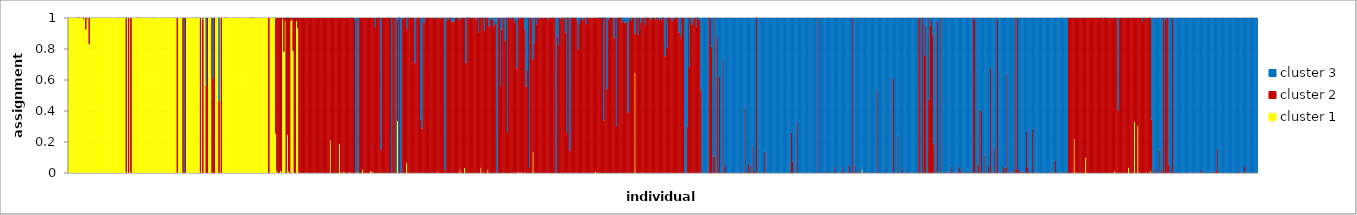
| Category | cluster 1 | cluster 2 | cluster 3 |
|---|---|---|---|
| 0 | 1 | 0 | 0 |
| 1 | 1 | 0 | 0 |
| 2 | 1 | 0 | 0 |
| 3 | 1 | 0 | 0 |
| 4 | 1 | 0 | 0 |
| 5 | 1 | 0 | 0 |
| 6 | 1 | 0 | 0 |
| 7 | 1 | 0 | 0 |
| 8 | 1 | 0 | 0 |
| 9 | 0.999 | 0.001 | 0 |
| 10 | 1 | 0 | 0 |
| 11 | 1 | 0 | 0 |
| 12 | 1 | 0 | 0 |
| 13 | 0.992 | 0.008 | 0 |
| 14 | 1 | 0 | 0 |
| 15 | 0.924 | 0.076 | 0 |
| 16 | 0.995 | 0.005 | 0 |
| 17 | 1 | 0 | 0 |
| 18 | 0.828 | 0.172 | 0 |
| 19 | 1 | 0 | 0 |
| 20 | 1 | 0 | 0 |
| 21 | 1 | 0 | 0 |
| 22 | 1 | 0 | 0 |
| 23 | 1 | 0 | 0 |
| 24 | 1 | 0 | 0 |
| 25 | 1 | 0 | 0 |
| 26 | 1 | 0 | 0 |
| 27 | 1 | 0 | 0 |
| 28 | 1 | 0 | 0 |
| 29 | 1 | 0 | 0 |
| 30 | 1 | 0 | 0 |
| 31 | 1 | 0 | 0 |
| 32 | 1 | 0 | 0 |
| 33 | 1 | 0 | 0 |
| 34 | 1 | 0 | 0 |
| 35 | 1 | 0 | 0 |
| 36 | 1 | 0 | 0 |
| 37 | 1 | 0 | 0 |
| 38 | 1 | 0 | 0 |
| 39 | 1 | 0 | 0 |
| 40 | 1 | 0 | 0 |
| 41 | 1 | 0 | 0 |
| 42 | 1 | 0 | 0 |
| 43 | 0.997 | 0.003 | 0 |
| 44 | 1 | 0 | 0 |
| 45 | 1 | 0 | 0 |
| 46 | 1 | 0 | 0 |
| 47 | 1 | 0 | 0 |
| 48 | 1 | 0 | 0 |
| 49 | 1 | 0 | 0 |
| 50 | 0.001 | 0.998 | 0.001 |
| 51 | 1 | 0 | 0 |
| 52 | 0 | 1 | 0 |
| 53 | 1 | 0 | 0 |
| 54 | 0 | 1 | 0 |
| 55 | 1 | 0 | 0 |
| 56 | 1 | 0 | 0 |
| 57 | 1 | 0 | 0 |
| 58 | 1 | 0 | 0 |
| 59 | 1 | 0 | 0 |
| 60 | 1 | 0 | 0 |
| 61 | 0.998 | 0.002 | 0 |
| 62 | 1 | 0 | 0 |
| 63 | 1 | 0 | 0 |
| 64 | 1 | 0 | 0 |
| 65 | 1 | 0 | 0 |
| 66 | 1 | 0 | 0 |
| 67 | 1 | 0 | 0 |
| 68 | 1 | 0 | 0 |
| 69 | 1 | 0 | 0 |
| 70 | 1 | 0 | 0 |
| 71 | 1 | 0 | 0 |
| 72 | 1 | 0 | 0 |
| 73 | 0.997 | 0.003 | 0 |
| 74 | 1 | 0 | 0 |
| 75 | 1 | 0 | 0 |
| 76 | 1 | 0 | 0 |
| 77 | 1 | 0 | 0 |
| 78 | 1 | 0 | 0 |
| 79 | 1 | 0 | 0 |
| 80 | 1 | 0 | 0 |
| 81 | 1 | 0 | 0 |
| 82 | 1 | 0 | 0 |
| 83 | 1 | 0 | 0 |
| 84 | 1 | 0 | 0 |
| 85 | 1 | 0 | 0 |
| 86 | 1 | 0 | 0 |
| 87 | 1 | 0 | 0 |
| 88 | 1 | 0 | 0 |
| 89 | 1 | 0 | 0 |
| 90 | 1 | 0 | 0 |
| 91 | 1 | 0 | 0 |
| 92 | 1 | 0 | 0 |
| 93 | 1 | 0 | 0 |
| 94 | 0 | 1 | 0 |
| 95 | 1 | 0 | 0 |
| 96 | 1 | 0 | 0 |
| 97 | 1 | 0 | 0 |
| 98 | 1 | 0 | 0 |
| 99 | 0 | 1 | 0 |
| 100 | 0 | 0 | 1 |
| 101 | 0.001 | 0.999 | 0 |
| 102 | 1 | 0 | 0 |
| 103 | 1 | 0 | 0 |
| 104 | 1 | 0 | 0 |
| 105 | 1 | 0 | 0 |
| 106 | 1 | 0 | 0 |
| 107 | 1 | 0 | 0 |
| 108 | 1 | 0 | 0 |
| 109 | 1 | 0 | 0 |
| 110 | 1 | 0 | 0 |
| 111 | 0.998 | 0.002 | 0 |
| 112 | 1 | 0 | 0 |
| 113 | 1 | 0 | 0 |
| 114 | 0 | 1 | 0 |
| 115 | 1 | 0 | 0 |
| 116 | 0 | 0.988 | 0.012 |
| 117 | 1 | 0 | 0 |
| 118 | 1 | 0 | 0 |
| 119 | 0 | 0.563 | 0.437 |
| 120 | 0 | 1 | 0 |
| 121 | 1 | 0 | 0 |
| 122 | 1 | 0 | 0 |
| 123 | 1 | 0 | 0 |
| 124 | 0 | 1 | 0 |
| 125 | 0 | 0.609 | 0.391 |
| 126 | 0 | 1 | 0 |
| 127 | 1 | 0 | 0 |
| 128 | 1 | 0 | 0 |
| 129 | 1 | 0 | 0 |
| 130 | 0 | 0.464 | 0.536 |
| 131 | 1 | 0 | 0 |
| 132 | 0 | 0.997 | 0.003 |
| 133 | 1 | 0 | 0 |
| 134 | 1 | 0 | 0 |
| 135 | 1 | 0 | 0 |
| 136 | 0.999 | 0.001 | 0 |
| 137 | 1 | 0 | 0 |
| 138 | 1 | 0 | 0 |
| 139 | 1 | 0 | 0 |
| 140 | 1 | 0 | 0 |
| 141 | 1 | 0 | 0 |
| 142 | 1 | 0 | 0 |
| 143 | 1 | 0 | 0 |
| 144 | 1 | 0 | 0 |
| 145 | 1 | 0 | 0 |
| 146 | 0.998 | 0.002 | 0 |
| 147 | 1 | 0 | 0 |
| 148 | 1 | 0 | 0 |
| 149 | 1 | 0 | 0 |
| 150 | 1 | 0 | 0 |
| 151 | 1 | 0 | 0 |
| 152 | 1 | 0 | 0 |
| 153 | 1 | 0 | 0 |
| 154 | 1 | 0 | 0 |
| 155 | 1 | 0 | 0 |
| 156 | 1 | 0 | 0 |
| 157 | 1 | 0 | 0 |
| 158 | 0.998 | 0.002 | 0 |
| 159 | 1 | 0 | 0 |
| 160 | 0.998 | 0.002 | 0 |
| 161 | 1 | 0 | 0 |
| 162 | 1 | 0 | 0 |
| 163 | 1 | 0 | 0 |
| 164 | 1 | 0 | 0 |
| 165 | 1 | 0 | 0 |
| 166 | 1 | 0 | 0 |
| 167 | 1 | 0 | 0 |
| 168 | 1 | 0 | 0 |
| 169 | 1 | 0 | 0 |
| 170 | 1 | 0 | 0 |
| 171 | 1 | 0 | 0 |
| 172 | 1 | 0 | 0 |
| 173 | 0 | 1 | 0 |
| 174 | 1 | 0 | 0 |
| 175 | 1 | 0 | 0 |
| 176 | 1 | 0 | 0 |
| 177 | 1 | 0 | 0 |
| 178 | 1 | 0 | 0 |
| 179 | 0.252 | 0.744 | 0.003 |
| 180 | 0.007 | 0.993 | 0 |
| 181 | 0 | 1 | 0 |
| 182 | 0 | 1 | 0 |
| 183 | 0.013 | 0.987 | 0 |
| 184 | 0.005 | 0.995 | 0 |
| 185 | 0.994 | 0.006 | 0 |
| 186 | 0.781 | 0.219 | 0 |
| 187 | 0.981 | 0.019 | 0 |
| 188 | 0 | 0.999 | 0.001 |
| 189 | 0.243 | 0.757 | 0 |
| 190 | 0.008 | 0.991 | 0.001 |
| 191 | 0 | 1 | 0 |
| 192 | 0.98 | 0.02 | 0 |
| 193 | 0.987 | 0.013 | 0 |
| 194 | 0.786 | 0.214 | 0 |
| 195 | 0.001 | 0.999 | 0 |
| 196 | 0 | 1 | 0 |
| 197 | 0.98 | 0.02 | 0 |
| 198 | 0.931 | 0.069 | 0 |
| 199 | 0.001 | 0.997 | 0.002 |
| 200 | 0 | 1 | 0 |
| 201 | 0 | 1 | 0 |
| 202 | 0 | 1 | 0 |
| 203 | 0 | 1 | 0 |
| 204 | 0 | 1 | 0 |
| 205 | 0 | 1 | 0 |
| 206 | 0 | 1 | 0 |
| 207 | 0 | 1 | 0 |
| 208 | 0 | 1 | 0 |
| 209 | 0 | 1 | 0 |
| 210 | 0 | 1 | 0 |
| 211 | 0 | 1 | 0 |
| 212 | 0 | 1 | 0 |
| 213 | 0 | 1 | 0 |
| 214 | 0 | 1 | 0 |
| 215 | 0 | 1 | 0 |
| 216 | 0 | 1 | 0 |
| 217 | 0 | 1 | 0 |
| 218 | 0 | 1 | 0 |
| 219 | 0 | 1 | 0 |
| 220 | 0 | 1 | 0 |
| 221 | 0 | 1 | 0 |
| 222 | 0 | 1 | 0 |
| 223 | 0 | 1 | 0 |
| 224 | 0 | 1 | 0 |
| 225 | 0 | 1 | 0 |
| 226 | 0.208 | 0.792 | 0 |
| 227 | 0 | 1 | 0 |
| 228 | 0 | 1 | 0 |
| 229 | 0 | 1 | 0 |
| 230 | 0 | 1 | 0 |
| 231 | 0 | 1 | 0 |
| 232 | 0 | 1 | 0 |
| 233 | 0 | 1 | 0 |
| 234 | 0.186 | 0.814 | 0 |
| 235 | 0.001 | 0.999 | 0 |
| 236 | 0 | 1 | 0 |
| 237 | 0.003 | 0.997 | 0 |
| 238 | 0.005 | 0.995 | 0 |
| 239 | 0 | 1 | 0 |
| 240 | 0 | 1 | 0 |
| 241 | 0 | 1 | 0 |
| 242 | 0 | 1 | 0 |
| 243 | 0.004 | 0.996 | 0 |
| 244 | 0 | 0.999 | 0.001 |
| 245 | 0 | 1 | 0 |
| 246 | 0 | 1 | 0 |
| 247 | 0 | 0.987 | 0.013 |
| 248 | 0 | 0 | 1 |
| 249 | 0.005 | 0.995 | 0 |
| 250 | 0 | 0 | 1 |
| 251 | 0.001 | 0.999 | 0 |
| 252 | 0 | 1 | 0 |
| 253 | 0 | 1 | 0 |
| 254 | 0.019 | 0.981 | 0 |
| 255 | 0 | 1 | 0 |
| 256 | 0 | 1 | 0 |
| 257 | 0 | 1 | 0 |
| 258 | 0 | 1 | 0 |
| 259 | 0 | 1 | 0 |
| 260 | 0.002 | 0.998 | 0 |
| 261 | 0.011 | 0.989 | 0 |
| 262 | 0.003 | 0.997 | 0 |
| 263 | 0.001 | 0.999 | 0 |
| 264 | 0 | 1 | 0 |
| 265 | 0 | 0.941 | 0.059 |
| 266 | 0 | 1 | 0 |
| 267 | 0 | 1 | 0 |
| 268 | 0 | 0.999 | 0.001 |
| 269 | 0 | 1 | 0 |
| 270 | 0 | 0.149 | 0.851 |
| 271 | 0 | 1 | 0 |
| 272 | 0 | 1 | 0 |
| 273 | 0 | 1 | 0 |
| 274 | 0 | 1 | 0 |
| 275 | 0 | 1 | 0 |
| 276 | 0 | 0.999 | 0.001 |
| 277 | 0 | 1 | 0 |
| 278 | 0 | 1 | 0 |
| 279 | 0 | 0 | 1 |
| 280 | 0 | 1 | 0 |
| 281 | 0 | 1 | 0 |
| 282 | 0 | 1 | 0 |
| 283 | 0 | 0.002 | 0.998 |
| 284 | 0.334 | 0.656 | 0.011 |
| 285 | 0 | 0 | 1 |
| 286 | 0 | 0.999 | 0.001 |
| 287 | 0 | 0 | 1 |
| 288 | 0.002 | 0.994 | 0.004 |
| 289 | 0 | 0.994 | 0.006 |
| 290 | 0 | 1 | 0 |
| 291 | 0 | 1 | 0 |
| 292 | 0.063 | 0.865 | 0.072 |
| 293 | 0 | 1 | 0 |
| 294 | 0 | 1 | 0 |
| 295 | 0 | 0.999 | 0.001 |
| 296 | 0 | 1 | 0 |
| 297 | 0.002 | 0.998 | 0 |
| 298 | 0 | 1 | 0 |
| 299 | 0 | 0.71 | 0.29 |
| 300 | 0 | 0.995 | 0.005 |
| 301 | 0 | 1 | 0 |
| 302 | 0 | 1 | 0 |
| 303 | 0 | 1 | 0 |
| 304 | 0 | 0.344 | 0.656 |
| 305 | 0 | 0.284 | 0.716 |
| 306 | 0 | 1 | 0 |
| 307 | 0 | 0.969 | 0.031 |
| 308 | 0 | 1 | 0 |
| 309 | 0 | 1 | 0 |
| 310 | 0 | 1 | 0 |
| 311 | 0 | 1 | 0 |
| 312 | 0 | 1 | 0 |
| 313 | 0 | 1 | 0 |
| 314 | 0 | 0.998 | 0.002 |
| 315 | 0 | 1 | 0 |
| 316 | 0 | 0.992 | 0.008 |
| 317 | 0 | 1 | 0 |
| 318 | 0 | 0.996 | 0.004 |
| 319 | 0.002 | 0.998 | 0 |
| 320 | 0 | 0.997 | 0.003 |
| 321 | 0 | 1 | 0 |
| 322 | 0 | 0.994 | 0.006 |
| 323 | 0 | 1 | 0 |
| 324 | 0 | 0.999 | 0.001 |
| 325 | 0 | 0.017 | 0.983 |
| 326 | 0 | 0.98 | 0.02 |
| 327 | 0 | 1 | 0 |
| 328 | 0 | 0.988 | 0.012 |
| 329 | 0 | 1 | 0 |
| 330 | 0 | 0.998 | 0.002 |
| 331 | 0 | 0.976 | 0.024 |
| 332 | 0 | 0.973 | 0.027 |
| 333 | 0 | 0.977 | 0.023 |
| 334 | 0 | 1 | 0 |
| 335 | 0 | 1 | 0 |
| 336 | 0 | 1 | 0 |
| 337 | 0 | 0.992 | 0.008 |
| 338 | 0.02 | 0.969 | 0.011 |
| 339 | 0 | 1 | 0 |
| 340 | 0 | 1 | 0 |
| 341 | 0 | 1 | 0 |
| 342 | 0.03 | 0.97 | 0 |
| 343 | 0 | 0.709 | 0.291 |
| 344 | 0 | 0.999 | 0.001 |
| 345 | 0 | 0.998 | 0.002 |
| 346 | 0 | 1 | 0 |
| 347 | 0 | 1 | 0 |
| 348 | 0 | 1 | 0 |
| 349 | 0 | 1 | 0 |
| 350 | 0 | 1 | 0 |
| 351 | 0 | 0.99 | 0.01 |
| 352 | 0 | 1 | 0 |
| 353 | 0 | 0.996 | 0.004 |
| 354 | 0 | 0.905 | 0.095 |
| 355 | 0 | 1 | 0 |
| 356 | 0.031 | 0.967 | 0.002 |
| 357 | 0 | 1 | 0 |
| 358 | 0 | 0.998 | 0.002 |
| 359 | 0 | 0.918 | 0.082 |
| 360 | 0 | 1 | 0 |
| 361 | 0 | 1 | 0 |
| 362 | 0.018 | 0.98 | 0.002 |
| 363 | 0 | 0.946 | 0.054 |
| 364 | 0 | 0.995 | 0.005 |
| 365 | 0 | 0.992 | 0.008 |
| 366 | 0 | 0.99 | 0.01 |
| 367 | 0 | 0.945 | 0.055 |
| 368 | 0 | 0.959 | 0.041 |
| 369 | 0 | 0.981 | 0.019 |
| 370 | 0 | 0 | 1 |
| 371 | 0 | 1 | 0 |
| 372 | 0 | 1 | 0 |
| 373 | 0 | 0.559 | 0.441 |
| 374 | 0 | 0.924 | 0.076 |
| 375 | 0 | 1 | 0 |
| 376 | 0 | 1 | 0 |
| 377 | 0 | 0.854 | 0.146 |
| 378 | 0 | 0.998 | 0.002 |
| 379 | 0 | 0.262 | 0.738 |
| 380 | 0 | 0.998 | 0.002 |
| 381 | 0 | 1 | 0 |
| 382 | 0 | 0.994 | 0.006 |
| 383 | 0 | 1 | 0 |
| 384 | 0.001 | 0.996 | 0.003 |
| 385 | 0 | 0.967 | 0.033 |
| 386 | 0 | 0.99 | 0.01 |
| 387 | 0 | 0.675 | 0.325 |
| 388 | 0.004 | 0.993 | 0.003 |
| 389 | 0.001 | 0.997 | 0.002 |
| 390 | 0 | 0.993 | 0.007 |
| 391 | 0.003 | 0.996 | 0.001 |
| 392 | 0 | 1 | 0 |
| 393 | 0 | 0.997 | 0.003 |
| 394 | 0.001 | 0.924 | 0.075 |
| 395 | 0 | 0.556 | 0.444 |
| 396 | 0 | 0.662 | 0.338 |
| 397 | 0 | 1 | 0 |
| 398 | 0 | 0.031 | 0.969 |
| 399 | 0 | 0.994 | 0.006 |
| 400 | 0 | 1 | 0 |
| 401 | 0.133 | 0.599 | 0.268 |
| 402 | 0 | 0.84 | 0.16 |
| 403 | 0 | 0.997 | 0.003 |
| 404 | 0 | 0.958 | 0.042 |
| 405 | 0 | 1 | 0 |
| 406 | 0 | 0.996 | 0.004 |
| 407 | 0 | 1 | 0 |
| 408 | 0 | 1 | 0 |
| 409 | 0 | 1 | 0 |
| 410 | 0 | 0.994 | 0.006 |
| 411 | 0 | 1 | 0 |
| 412 | 0 | 1 | 0 |
| 413 | 0 | 1 | 0 |
| 414 | 0 | 0.99 | 0.01 |
| 415 | 0 | 1 | 0 |
| 416 | 0 | 1 | 0 |
| 417 | 0 | 1 | 0 |
| 418 | 0 | 1 | 0 |
| 419 | 0 | 1 | 0 |
| 420 | 0 | 1 | 0 |
| 421 | 0 | 0 | 1 |
| 422 | 0 | 0.879 | 0.121 |
| 423 | 0 | 0.823 | 0.177 |
| 424 | 0 | 1 | 0 |
| 425 | 0 | 0.995 | 0.005 |
| 426 | 0 | 0.998 | 0.002 |
| 427 | 0 | 1 | 0 |
| 428 | 0 | 1 | 0 |
| 429 | 0 | 0.902 | 0.098 |
| 430 | 0 | 0.255 | 0.745 |
| 431 | 0 | 0.999 | 0.001 |
| 432 | 0 | 1 | 0 |
| 433 | 0 | 0.144 | 0.856 |
| 434 | 0 | 0.998 | 0.002 |
| 435 | 0 | 1 | 0 |
| 436 | 0 | 1 | 0 |
| 437 | 0 | 1 | 0 |
| 438 | 0 | 1 | 0 |
| 439 | 0 | 0.984 | 0.016 |
| 440 | 0 | 0.795 | 0.205 |
| 441 | 0 | 0.965 | 0.035 |
| 442 | 0 | 0.991 | 0.009 |
| 443 | 0 | 1 | 0 |
| 444 | 0 | 0.988 | 0.012 |
| 445 | 0 | 1 | 0 |
| 446 | 0 | 1 | 0 |
| 447 | 0 | 0.959 | 0.041 |
| 448 | 0 | 0.999 | 0.001 |
| 449 | 0 | 0.996 | 0.004 |
| 450 | 0 | 1 | 0 |
| 451 | 0 | 1 | 0 |
| 452 | 0 | 1 | 0 |
| 453 | 0 | 1 | 0 |
| 454 | 0 | 1 | 0 |
| 455 | 0.006 | 0.994 | 0 |
| 456 | 0 | 1 | 0 |
| 457 | 0 | 1 | 0 |
| 458 | 0 | 0.999 | 0.001 |
| 459 | 0 | 0.999 | 0.001 |
| 460 | 0 | 1 | 0 |
| 461 | 0 | 0.999 | 0.001 |
| 462 | 0 | 0.338 | 0.662 |
| 463 | 0 | 0.999 | 0.001 |
| 464 | 0 | 1 | 0 |
| 465 | 0 | 0.539 | 0.461 |
| 466 | 0 | 0.986 | 0.014 |
| 467 | 0 | 1 | 0 |
| 468 | 0 | 0.998 | 0.002 |
| 469 | 0 | 1 | 0 |
| 470 | 0 | 1 | 0 |
| 471 | 0 | 0.87 | 0.13 |
| 472 | 0 | 1 | 0 |
| 473 | 0 | 0.301 | 0.699 |
| 474 | 0 | 1 | 0 |
| 475 | 0 | 0.999 | 0.001 |
| 476 | 0 | 1 | 0 |
| 477 | 0 | 0.999 | 0.001 |
| 478 | 0 | 0.97 | 0.03 |
| 479 | 0 | 0.986 | 0.014 |
| 480 | 0 | 0.968 | 0.032 |
| 481 | 0 | 0.968 | 0.032 |
| 482 | 0 | 0.988 | 0.012 |
| 483 | 0 | 0.387 | 0.613 |
| 484 | 0.001 | 0.986 | 0.013 |
| 485 | 0 | 1 | 0 |
| 486 | 0 | 0.98 | 0.02 |
| 487 | 0 | 1 | 0 |
| 488 | 0 | 1 | 0 |
| 489 | 0.642 | 0.256 | 0.102 |
| 490 | 0 | 1 | 0 |
| 491 | 0 | 0.998 | 0.002 |
| 492 | 0 | 0.89 | 0.11 |
| 493 | 0 | 1 | 0 |
| 494 | 0 | 0.97 | 0.03 |
| 495 | 0 | 0.997 | 0.003 |
| 496 | 0 | 1 | 0 |
| 497 | 0 | 1 | 0 |
| 498 | 0 | 0.952 | 0.048 |
| 499 | 0 | 0.999 | 0.001 |
| 500 | 0 | 1 | 0 |
| 501 | 0 | 1 | 0 |
| 502 | 0 | 0.996 | 0.004 |
| 503 | 0 | 0.986 | 0.014 |
| 504 | 0 | 1 | 0 |
| 505 | 0 | 1 | 0 |
| 506 | 0 | 1 | 0 |
| 507 | 0 | 0.988 | 0.012 |
| 508 | 0 | 1 | 0 |
| 509 | 0 | 1 | 0 |
| 510 | 0 | 0.99 | 0.01 |
| 511 | 0 | 1 | 0 |
| 512 | 0 | 0.984 | 0.016 |
| 513 | 0 | 0.999 | 0.001 |
| 514 | 0 | 1 | 0 |
| 515 | 0 | 0.751 | 0.249 |
| 516 | 0 | 1 | 0 |
| 517 | 0 | 0.807 | 0.193 |
| 518 | 0 | 1 | 0 |
| 519 | 0 | 1 | 0 |
| 520 | 0 | 1 | 0 |
| 521 | 0 | 0.978 | 0.022 |
| 522 | 0 | 1 | 0 |
| 523 | 0 | 0.993 | 0.007 |
| 524 | 0 | 1 | 0 |
| 525 | 0 | 0.999 | 0.001 |
| 526 | 0 | 1 | 0 |
| 527 | 0 | 0.905 | 0.095 |
| 528 | 0 | 1 | 0 |
| 529 | 0 | 0.875 | 0.125 |
| 530 | 0 | 1 | 0 |
| 531 | 0 | 1 | 0 |
| 532 | 0 | 0 | 1 |
| 533 | 0 | 0.001 | 0.999 |
| 534 | 0 | 0.298 | 0.702 |
| 535 | 0 | 1 | 0 |
| 536 | 0 | 0.683 | 0.317 |
| 537 | 0 | 1 | 0 |
| 538 | 0 | 0.958 | 0.042 |
| 539 | 0 | 0.984 | 0.016 |
| 540 | 0 | 1 | 0 |
| 541 | 0 | 1 | 0 |
| 542 | 0 | 0.943 | 0.057 |
| 543 | 0 | 0.999 | 0.001 |
| 544 | 0 | 0.99 | 0.01 |
| 545 | 0 | 0.985 | 0.015 |
| 546 | 0 | 0.532 | 0.468 |
| 547 | 0 | 0 | 1 |
| 548 | 0 | 0 | 1 |
| 549 | 0 | 0.001 | 0.999 |
| 550 | 0 | 0 | 1 |
| 551 | 0 | 0.001 | 0.999 |
| 552 | 0 | 0 | 1 |
| 553 | 0 | 1 | 0 |
| 554 | 0 | 0.997 | 0.003 |
| 555 | 0 | 0.812 | 0.188 |
| 556 | 0 | 0 | 1 |
| 557 | 0 | 0.104 | 0.896 |
| 558 | 0 | 1 | 0 |
| 559 | 0 | 0.001 | 0.999 |
| 560 | 0.001 | 0.879 | 0.12 |
| 561 | 0 | 0 | 1 |
| 562 | 0 | 0.617 | 0.383 |
| 563 | 0 | 0 | 1 |
| 564 | 0 | 0 | 1 |
| 565 | 0 | 0.732 | 0.268 |
| 566 | 0 | 0 | 1 |
| 567 | 0 | 0.049 | 0.951 |
| 568 | 0 | 0.001 | 0.999 |
| 569 | 0 | 0 | 1 |
| 570 | 0 | 0 | 1 |
| 571 | 0 | 0 | 1 |
| 572 | 0 | 0 | 1 |
| 573 | 0 | 0.001 | 0.999 |
| 574 | 0 | 0 | 1 |
| 575 | 0 | 0 | 1 |
| 576 | 0 | 0 | 1 |
| 577 | 0 | 0 | 1 |
| 578 | 0 | 0 | 1 |
| 579 | 0 | 0 | 1 |
| 580 | 0 | 0.001 | 0.999 |
| 581 | 0 | 0 | 1 |
| 582 | 0 | 0 | 1 |
| 583 | 0 | 0.008 | 0.992 |
| 584 | 0 | 0.422 | 0.578 |
| 585 | 0 | 0 | 1 |
| 586 | 0 | 0 | 1 |
| 587 | 0 | 0.058 | 0.942 |
| 588 | 0 | 0 | 1 |
| 589 | 0 | 0.043 | 0.957 |
| 590 | 0 | 0 | 1 |
| 591 | 0 | 0.173 | 0.827 |
| 592 | 0 | 0.012 | 0.988 |
| 593 | 0 | 0 | 1 |
| 594 | 0.001 | 0.997 | 0.002 |
| 595 | 0 | 0 | 1 |
| 596 | 0 | 0 | 1 |
| 597 | 0 | 0 | 1 |
| 598 | 0 | 0 | 1 |
| 599 | 0 | 0 | 1 |
| 600 | 0 | 0 | 1 |
| 601 | 0 | 0.137 | 0.863 |
| 602 | 0 | 0 | 1 |
| 603 | 0 | 0 | 1 |
| 604 | 0 | 0 | 1 |
| 605 | 0 | 0 | 1 |
| 606 | 0 | 0 | 1 |
| 607 | 0 | 0 | 1 |
| 608 | 0 | 0 | 1 |
| 609 | 0 | 0 | 1 |
| 610 | 0 | 0 | 1 |
| 611 | 0 | 0 | 1 |
| 612 | 0 | 0 | 1 |
| 613 | 0 | 0 | 1 |
| 614 | 0 | 0 | 1 |
| 615 | 0 | 0 | 1 |
| 616 | 0 | 0 | 1 |
| 617 | 0 | 0 | 1 |
| 618 | 0 | 0 | 1 |
| 619 | 0 | 0 | 1 |
| 620 | 0 | 0 | 1 |
| 621 | 0 | 0 | 1 |
| 622 | 0 | 0 | 1 |
| 623 | 0 | 0 | 1 |
| 624 | 0 | 0.258 | 0.742 |
| 625 | 0 | 0.072 | 0.928 |
| 626 | 0 | 0 | 1 |
| 627 | 0 | 0 | 1 |
| 628 | 0 | 0 | 1 |
| 629 | 0 | 0.327 | 0.673 |
| 630 | 0 | 0 | 1 |
| 631 | 0 | 0 | 1 |
| 632 | 0 | 0 | 1 |
| 633 | 0 | 0 | 1 |
| 634 | 0 | 0 | 1 |
| 635 | 0 | 0 | 1 |
| 636 | 0 | 0 | 1 |
| 637 | 0 | 0 | 1 |
| 638 | 0 | 0 | 1 |
| 639 | 0 | 0 | 1 |
| 640 | 0 | 0 | 1 |
| 641 | 0 | 0 | 1 |
| 642 | 0 | 0 | 1 |
| 643 | 0 | 0 | 1 |
| 644 | 0 | 0 | 1 |
| 645 | 0 | 0.001 | 0.999 |
| 646 | 0 | 0.001 | 0.999 |
| 647 | 0 | 1 | 0 |
| 648 | 0 | 0 | 1 |
| 649 | 0 | 0.001 | 0.999 |
| 650 | 0 | 0 | 1 |
| 651 | 0 | 0 | 1 |
| 652 | 0 | 0 | 1 |
| 653 | 0 | 0 | 1 |
| 654 | 0 | 0.016 | 0.984 |
| 655 | 0 | 0 | 1 |
| 656 | 0 | 0 | 1 |
| 657 | 0 | 0 | 1 |
| 658 | 0 | 0 | 1 |
| 659 | 0 | 0 | 1 |
| 660 | 0 | 0 | 1 |
| 661 | 0 | 0.039 | 0.961 |
| 662 | 0 | 0 | 1 |
| 663 | 0 | 0 | 1 |
| 664 | 0 | 0.001 | 0.999 |
| 665 | 0 | 0 | 1 |
| 666 | 0 | 0.006 | 0.994 |
| 667 | 0 | 0 | 1 |
| 668 | 0 | 0 | 1 |
| 669 | 0 | 0.023 | 0.977 |
| 670 | 0 | 0 | 1 |
| 671 | 0 | 0 | 1 |
| 672 | 0 | 0 | 1 |
| 673 | 0 | 0.001 | 0.999 |
| 674 | 0 | 0.05 | 0.95 |
| 675 | 0 | 0 | 1 |
| 676 | 0 | 0 | 1 |
| 677 | 0 | 1 | 0 |
| 678 | 0 | 0.004 | 0.996 |
| 679 | 0 | 0.044 | 0.956 |
| 680 | 0 | 0 | 1 |
| 681 | 0 | 0.001 | 0.999 |
| 682 | 0 | 0 | 1 |
| 683 | 0 | 0.009 | 0.991 |
| 684 | 0 | 0 | 1 |
| 685 | 0.023 | 0.001 | 0.976 |
| 686 | 0 | 0 | 1 |
| 687 | 0 | 0 | 1 |
| 688 | 0 | 0.003 | 0.997 |
| 689 | 0 | 0.002 | 0.998 |
| 690 | 0 | 0 | 1 |
| 691 | 0 | 0 | 1 |
| 692 | 0 | 0 | 1 |
| 693 | 0 | 0 | 1 |
| 694 | 0 | 0.007 | 0.993 |
| 695 | 0 | 0 | 1 |
| 696 | 0 | 0 | 1 |
| 697 | 0 | 0 | 1 |
| 698 | 0 | 0.529 | 0.471 |
| 699 | 0 | 0 | 1 |
| 700 | 0 | 0.001 | 0.999 |
| 701 | 0 | 0.001 | 0.999 |
| 702 | 0 | 0 | 1 |
| 703 | 0 | 0 | 1 |
| 704 | 0 | 0.001 | 0.999 |
| 705 | 0 | 0 | 1 |
| 706 | 0 | 0 | 1 |
| 707 | 0 | 0 | 1 |
| 708 | 0 | 0 | 1 |
| 709 | 0 | 0 | 1 |
| 710 | 0 | 0 | 1 |
| 711 | 0 | 0 | 1 |
| 712 | 0 | 0.61 | 0.39 |
| 713 | 0 | 0 | 1 |
| 714 | 0 | 0 | 1 |
| 715 | 0 | 0 | 1 |
| 716 | 0 | 0.24 | 0.76 |
| 717 | 0 | 0 | 1 |
| 718 | 0 | 0 | 1 |
| 719 | 0 | 0 | 1 |
| 720 | 0 | 0.022 | 0.978 |
| 721 | 0 | 0 | 1 |
| 722 | 0 | 0 | 1 |
| 723 | 0 | 0 | 1 |
| 724 | 0 | 0 | 1 |
| 725 | 0 | 0.001 | 0.999 |
| 726 | 0 | 0 | 1 |
| 727 | 0 | 0.003 | 0.997 |
| 728 | 0 | 0 | 1 |
| 729 | 0 | 0.001 | 0.999 |
| 730 | 0 | 0.003 | 0.997 |
| 731 | 0 | 0 | 1 |
| 732 | 0 | 0 | 1 |
| 733 | 0 | 0 | 1 |
| 734 | 0 | 0.995 | 0.005 |
| 735 | 0 | 1 | 0 |
| 736 | 0 | 0 | 1 |
| 737 | 0 | 1 | 0 |
| 738 | 0 | 0 | 1 |
| 739 | 0 | 0.757 | 0.243 |
| 740 | 0 | 0.95 | 0.05 |
| 741 | 0 | 0 | 1 |
| 742 | 0 | 1 | 0 |
| 743 | 0 | 0.471 | 0.529 |
| 744 | 0 | 0.95 | 0.05 |
| 745 | 0 | 0.986 | 0.014 |
| 746 | 0 | 0.894 | 0.106 |
| 747 | 0 | 0.186 | 0.814 |
| 748 | 0 | 0 | 1 |
| 749 | 0 | 0 | 1 |
| 750 | 0 | 0.978 | 0.022 |
| 751 | 0 | 0.003 | 0.997 |
| 752 | 0 | 0 | 1 |
| 753 | 0 | 1 | 0 |
| 754 | 0 | 0 | 1 |
| 755 | 0 | 0 | 1 |
| 756 | 0 | 0 | 1 |
| 757 | 0 | 0.007 | 0.993 |
| 758 | 0 | 0 | 1 |
| 759 | 0 | 0 | 1 |
| 760 | 0 | 0.008 | 0.992 |
| 761 | 0 | 0 | 1 |
| 762 | 0 | 0.039 | 0.961 |
| 763 | 0 | 0 | 1 |
| 764 | 0 | 0 | 1 |
| 765 | 0 | 0 | 1 |
| 766 | 0 | 0.007 | 0.993 |
| 767 | 0 | 0 | 1 |
| 768 | 0 | 0.002 | 0.998 |
| 769 | 0 | 0.036 | 0.964 |
| 770 | 0 | 0.016 | 0.984 |
| 771 | 0 | 0 | 1 |
| 772 | 0 | 0 | 1 |
| 773 | 0 | 0.001 | 0.999 |
| 774 | 0 | 0 | 1 |
| 775 | 0 | 0 | 1 |
| 776 | 0 | 0 | 1 |
| 777 | 0 | 0.008 | 0.992 |
| 778 | 0 | 0 | 1 |
| 779 | 0 | 0 | 1 |
| 780 | 0 | 0 | 1 |
| 781 | 0 | 1 | 0 |
| 782 | 0 | 0.987 | 0.013 |
| 783 | 0 | 0 | 1 |
| 784 | 0 | 0 | 1 |
| 785 | 0 | 0.05 | 0.95 |
| 786 | 0 | 0.408 | 0.592 |
| 787 | 0 | 0 | 1 |
| 788 | 0 | 0.398 | 0.602 |
| 789 | 0 | 0 | 1 |
| 790 | 0 | 0 | 1 |
| 791 | 0 | 0.116 | 0.884 |
| 792 | 0 | 0 | 1 |
| 793 | 0 | 0 | 1 |
| 794 | 0 | 0.043 | 0.957 |
| 795 | 0 | 0.002 | 0.998 |
| 796 | 0 | 0.676 | 0.324 |
| 797 | 0 | 0 | 1 |
| 798 | 0 | 0 | 1 |
| 799 | 0 | 0.159 | 0.841 |
| 800 | 0 | 0 | 1 |
| 801 | 0 | 0.008 | 0.992 |
| 802 | 0 | 0.992 | 0.008 |
| 803 | 0 | 0 | 1 |
| 804 | 0 | 0.008 | 0.992 |
| 805 | 0 | 0 | 1 |
| 806 | 0 | 0 | 1 |
| 807 | 0 | 0.038 | 0.962 |
| 808 | 0 | 0 | 1 |
| 809 | 0 | 0.033 | 0.967 |
| 810 | 0 | 0.64 | 0.36 |
| 811 | 0 | 0 | 1 |
| 812 | 0 | 0 | 1 |
| 813 | 0 | 0.004 | 0.996 |
| 814 | 0 | 0.004 | 0.996 |
| 815 | 0 | 0.001 | 0.999 |
| 816 | 0 | 0 | 1 |
| 817 | 0 | 1 | 0 |
| 818 | 0 | 0.021 | 0.979 |
| 819 | 0 | 1 | 0 |
| 820 | 0 | 0 | 1 |
| 821 | 0 | 0.018 | 0.982 |
| 822 | 0 | 0 | 1 |
| 823 | 0 | 0.007 | 0.993 |
| 824 | 0 | 0.008 | 0.992 |
| 825 | 0 | 0 | 1 |
| 826 | 0 | 0 | 1 |
| 827 | 0 | 0.265 | 0.735 |
| 828 | 0 | 0.036 | 0.964 |
| 829 | 0 | 0 | 1 |
| 830 | 0 | 0 | 1 |
| 831 | 0 | 0 | 1 |
| 832 | 0 | 0.283 | 0.717 |
| 833 | 0 | 0 | 1 |
| 834 | 0 | 0 | 1 |
| 835 | 0 | 0.008 | 0.992 |
| 836 | 0 | 0 | 1 |
| 837 | 0 | 0 | 1 |
| 838 | 0 | 0 | 1 |
| 839 | 0 | 0 | 1 |
| 840 | 0 | 0 | 1 |
| 841 | 0 | 0 | 1 |
| 842 | 0 | 0 | 1 |
| 843 | 0 | 0 | 1 |
| 844 | 0 | 0 | 1 |
| 845 | 0 | 0 | 1 |
| 846 | 0 | 0 | 1 |
| 847 | 0 | 0 | 1 |
| 848 | 0 | 0.007 | 0.993 |
| 849 | 0 | 0 | 1 |
| 850 | 0 | 0 | 1 |
| 851 | 0 | 0 | 1 |
| 852 | 0 | 0.077 | 0.923 |
| 853 | 0 | 0.001 | 0.999 |
| 854 | 0 | 0 | 1 |
| 855 | 0 | 0 | 1 |
| 856 | 0 | 0.003 | 0.997 |
| 857 | 0 | 0.005 | 0.995 |
| 858 | 0 | 0 | 1 |
| 859 | 0 | 0 | 1 |
| 860 | 0 | 0 | 1 |
| 861 | 0 | 0 | 1 |
| 862 | 0 | 0 | 1 |
| 863 | 0 | 1 | 0 |
| 864 | 0 | 1 | 0 |
| 865 | 0 | 1 | 0 |
| 866 | 0 | 1 | 0 |
| 867 | 0 | 1 | 0 |
| 868 | 0.216 | 0.784 | 0 |
| 869 | 0.001 | 0.999 | 0 |
| 870 | 0.001 | 0.999 | 0 |
| 871 | 0 | 1 | 0 |
| 872 | 0 | 1 | 0 |
| 873 | 0 | 1 | 0 |
| 874 | 0 | 1 | 0 |
| 875 | 0 | 1 | 0 |
| 876 | 0 | 1 | 0 |
| 877 | 0 | 1 | 0 |
| 878 | 0.096 | 0.904 | 0 |
| 879 | 0 | 1 | 0 |
| 880 | 0 | 1 | 0 |
| 881 | 0 | 1 | 0 |
| 882 | 0 | 1 | 0 |
| 883 | 0 | 1 | 0 |
| 884 | 0 | 1 | 0 |
| 885 | 0 | 1 | 0 |
| 886 | 0 | 1 | 0 |
| 887 | 0 | 1 | 0 |
| 888 | 0 | 1 | 0 |
| 889 | 0 | 1 | 0 |
| 890 | 0 | 1 | 0 |
| 891 | 0 | 1 | 0 |
| 892 | 0 | 0.999 | 0.001 |
| 893 | 0 | 0.996 | 0.004 |
| 894 | 0 | 1 | 0 |
| 895 | 0 | 0.999 | 0.001 |
| 896 | 0 | 1 | 0 |
| 897 | 0 | 1 | 0 |
| 898 | 0 | 1 | 0 |
| 899 | 0 | 1 | 0 |
| 900 | 0 | 1 | 0 |
| 901 | 0 | 0.993 | 0.007 |
| 902 | 0 | 1 | 0 |
| 903 | 0.008 | 0.992 | 0 |
| 904 | 0 | 1 | 0 |
| 905 | 0 | 1 | 0 |
| 906 | 0 | 0.402 | 0.598 |
| 907 | 0 | 1 | 0 |
| 908 | 0 | 1 | 0 |
| 909 | 0 | 1 | 0 |
| 910 | 0 | 1 | 0 |
| 911 | 0 | 1 | 0 |
| 912 | 0.001 | 0.993 | 0.006 |
| 913 | 0 | 1 | 0 |
| 914 | 0 | 1 | 0 |
| 915 | 0.032 | 0.968 | 0 |
| 916 | 0 | 1 | 0 |
| 917 | 0 | 1 | 0 |
| 918 | 0 | 1 | 0 |
| 919 | 0 | 1 | 0 |
| 920 | 0.327 | 0.673 | 0 |
| 921 | 0 | 1 | 0 |
| 922 | 0 | 1 | 0 |
| 923 | 0.302 | 0.698 | 0 |
| 924 | 0 | 1 | 0 |
| 925 | 0 | 1 | 0 |
| 926 | 0 | 1 | 0 |
| 927 | 0 | 0.974 | 0.026 |
| 928 | 0 | 1 | 0 |
| 929 | 0 | 1 | 0 |
| 930 | 0 | 1 | 0 |
| 931 | 0 | 1 | 0 |
| 932 | 0.001 | 0.999 | 0 |
| 933 | 0 | 0.999 | 0.001 |
| 934 | 0.01 | 0.99 | 0 |
| 935 | 0 | 0.343 | 0.657 |
| 936 | 0 | 0 | 1 |
| 937 | 0 | 0 | 1 |
| 938 | 0 | 0.024 | 0.976 |
| 939 | 0 | 0.001 | 0.999 |
| 940 | 0 | 0 | 1 |
| 941 | 0 | 0 | 1 |
| 942 | 0 | 0.149 | 0.851 |
| 943 | 0 | 0.01 | 0.99 |
| 944 | 0 | 0 | 1 |
| 945 | 0 | 1 | 0 |
| 946 | 0 | 0.005 | 0.995 |
| 947 | 0 | 0.989 | 0.011 |
| 948 | 0 | 1 | 0 |
| 949 | 0 | 1 | 0 |
| 950 | 0 | 0.052 | 0.948 |
| 951 | 0 | 0 | 1 |
| 952 | 0 | 0 | 1 |
| 953 | 0 | 0.993 | 0.007 |
| 954 | 0 | 0.008 | 0.992 |
| 955 | 0 | 0 | 1 |
| 956 | 0 | 0.001 | 0.999 |
| 957 | 0 | 0 | 1 |
| 958 | 0 | 0 | 1 |
| 959 | 0 | 0 | 1 |
| 960 | 0 | 0 | 1 |
| 961 | 0 | 0 | 1 |
| 962 | 0 | 0 | 1 |
| 963 | 0 | 0.005 | 0.995 |
| 964 | 0 | 0 | 1 |
| 965 | 0 | 0 | 1 |
| 966 | 0 | 0 | 1 |
| 967 | 0 | 0.001 | 0.999 |
| 968 | 0 | 0 | 1 |
| 969 | 0 | 0.003 | 0.997 |
| 970 | 0 | 0 | 1 |
| 971 | 0 | 0 | 1 |
| 972 | 0 | 0.003 | 0.997 |
| 973 | 0 | 0.001 | 0.999 |
| 974 | 0 | 0 | 1 |
| 975 | 0 | 0 | 1 |
| 976 | 0 | 0 | 1 |
| 977 | 0 | 0 | 1 |
| 978 | 0 | 0.018 | 0.982 |
| 979 | 0 | 0 | 1 |
| 980 | 0 | 0 | 1 |
| 981 | 0 | 0 | 1 |
| 982 | 0 | 0 | 1 |
| 983 | 0 | 0 | 1 |
| 984 | 0 | 0 | 1 |
| 985 | 0 | 0 | 1 |
| 986 | 0 | 0 | 1 |
| 987 | 0 | 0.008 | 0.992 |
| 988 | 0 | 0 | 1 |
| 989 | 0 | 0 | 1 |
| 990 | 0 | 0.007 | 0.993 |
| 991 | 0 | 0.014 | 0.986 |
| 992 | 0 | 0.154 | 0.846 |
| 993 | 0 | 0 | 1 |
| 994 | 0 | 0 | 1 |
| 995 | 0 | 0 | 1 |
| 996 | 0 | 0 | 1 |
| 997 | 0 | 0 | 1 |
| 998 | 0 | 0 | 1 |
| 999 | 0 | 0 | 1 |
| 1000 | 0 | 0 | 1 |
| 1001 | 0 | 0 | 1 |
| 1002 | 0 | 0 | 1 |
| 1003 | 0 | 0 | 1 |
| 1004 | 0 | 0.001 | 0.999 |
| 1005 | 0 | 0 | 1 |
| 1006 | 0 | 0 | 1 |
| 1007 | 0 | 0 | 1 |
| 1008 | 0 | 0 | 1 |
| 1009 | 0 | 0 | 1 |
| 1010 | 0 | 0.012 | 0.988 |
| 1011 | 0 | 0 | 1 |
| 1012 | 0 | 0 | 1 |
| 1013 | 0 | 0 | 1 |
| 1014 | 0 | 0 | 1 |
| 1015 | 0 | 0.044 | 0.956 |
| 1016 | 0 | 0 | 1 |
| 1017 | 0 | 0 | 1 |
| 1018 | 0 | 0 | 1 |
| 1019 | 0 | 0 | 1 |
| 1020 | 0 | 0 | 1 |
| 1021 | 0 | 0.002 | 0.998 |
| 1022 | 0 | 0.001 | 0.999 |
| 1023 | 0 | 0 | 1 |
| 1024 | 0 | 0 | 1 |
| 1025 | 0 | 0 | 1 |
| 1026 | 0 | 0 | 1 |